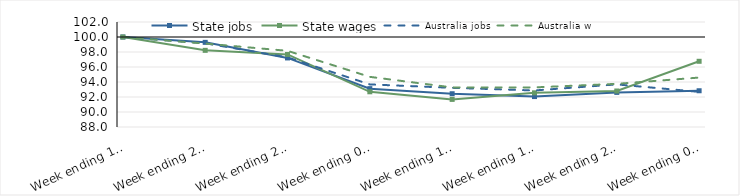
| Category | State jobs | State wages | Australia jobs | Australia wages |
|---|---|---|---|---|
| 2020-03-14 | 100 | 100 | 100 | 100 |
| 2020-03-21 | 99.286 | 98.222 | 99.165 | 99.123 |
| 2020-03-28 | 97.209 | 97.672 | 97.282 | 98.156 |
| 2020-04-04 | 93.115 | 92.695 | 93.679 | 94.686 |
| 2020-04-11 | 92.436 | 91.68 | 93.222 | 93.277 |
| 2020-04-18 | 92.058 | 92.557 | 92.871 | 93.281 |
| 2020-04-25 | 92.613 | 92.801 | 93.679 | 93.754 |
| 2020-05-02 | 92.833 | 96.761 | 92.686 | 94.591 |